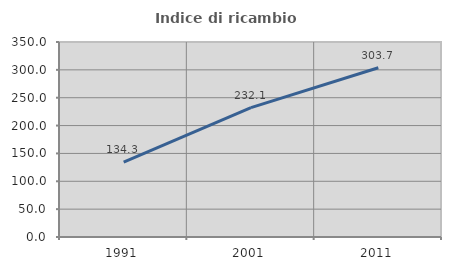
| Category | Indice di ricambio occupazionale  |
|---|---|
| 1991.0 | 134.286 |
| 2001.0 | 232.143 |
| 2011.0 | 303.727 |